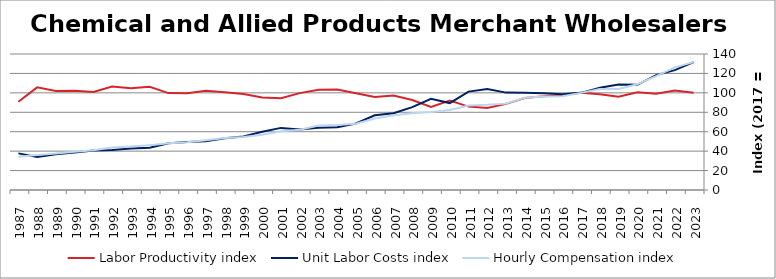
| Category | Labor Productivity index | Unit Labor Costs index | Hourly Compensation index |
|---|---|---|---|
| 2023.0 | 100.014 | 131.588 | 131.607 |
| 2022.0 | 102.291 | 123.407 | 126.234 |
| 2021.0 | 99.058 | 118.293 | 117.178 |
| 2020.0 | 100.607 | 108.227 | 108.885 |
| 2019.0 | 95.903 | 108.495 | 104.05 |
| 2018.0 | 98.612 | 105.316 | 103.855 |
| 2017.0 | 100 | 100 | 100 |
| 2016.0 | 97.894 | 98.619 | 96.542 |
| 2015.0 | 96.564 | 99.578 | 96.156 |
| 2014.0 | 94.724 | 100.209 | 94.922 |
| 2013.0 | 88.694 | 100.244 | 88.911 |
| 2012.0 | 84.338 | 103.981 | 87.695 |
| 2011.0 | 85.831 | 101.297 | 86.945 |
| 2010.0 | 92.055 | 89.493 | 82.383 |
| 2009.0 | 85.463 | 93.921 | 80.268 |
| 2008.0 | 92.628 | 85.35 | 79.058 |
| 2007.0 | 97.371 | 78.957 | 76.881 |
| 2006.0 | 95.647 | 76.884 | 73.537 |
| 2005.0 | 99.548 | 68.445 | 68.135 |
| 2004.0 | 103.428 | 64.672 | 66.89 |
| 2003.0 | 103.295 | 64.178 | 66.292 |
| 2002.0 | 99.728 | 62.309 | 62.14 |
| 2001.0 | 94.529 | 63.936 | 60.438 |
| 2000.0 | 95.114 | 59.878 | 56.953 |
| 1999.0 | 98.906 | 55.074 | 54.472 |
| 1998.0 | 100.522 | 53.224 | 53.502 |
| 1997.0 | 102.131 | 50.12 | 51.188 |
| 1996.0 | 99.59 | 49.482 | 49.279 |
| 1995.0 | 99.75 | 48.144 | 48.024 |
| 1994.0 | 106.219 | 43.465 | 46.168 |
| 1993.0 | 104.738 | 42.667 | 44.689 |
| 1992.0 | 106.439 | 41.134 | 43.782 |
| 1991.0 | 100.823 | 40.698 | 41.032 |
| 1990.0 | 102.244 | 38.579 | 39.445 |
| 1989.0 | 101.822 | 36.802 | 37.472 |
| 1988.0 | 105.635 | 34.016 | 35.932 |
| 1987.0 | 90.77 | 37.69 | 34.211 |